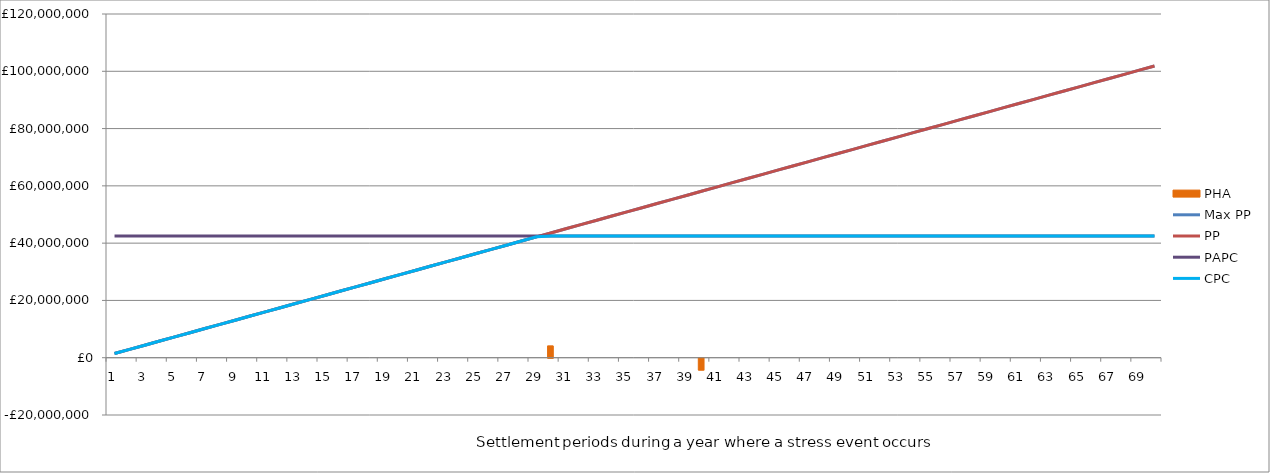
| Category | PHA |
|---|---|
| 0 | 0 |
| 1 | 0 |
| 2 | 0 |
| 3 | 0 |
| 4 | 0 |
| 5 | 0 |
| 6 | 0 |
| 7 | 0 |
| 8 | 0 |
| 9 | 0 |
| 10 | 0 |
| 11 | 0 |
| 12 | 0 |
| 13 | 0 |
| 14 | 0 |
| 15 | 0 |
| 16 | 0 |
| 17 | 0 |
| 18 | 0 |
| 19 | 0 |
| 20 | 0 |
| 21 | 0 |
| 22 | 0 |
| 23 | 0 |
| 24 | 0 |
| 25 | 0 |
| 26 | 0 |
| 27 | 0 |
| 28 | 0 |
| 29 | 4134000 |
| 30 | 0 |
| 31 | 0 |
| 32 | 0 |
| 33 | 0 |
| 34 | 0 |
| 35 | 0 |
| 36 | 0 |
| 37 | 0 |
| 38 | 0 |
| 39 | -4134000 |
| 40 | 0 |
| 41 | 0 |
| 42 | 0 |
| 43 | 0 |
| 44 | 0 |
| 45 | 0 |
| 46 | 0 |
| 47 | 0 |
| 48 | 0 |
| 49 | 0 |
| 50 | 0 |
| 51 | 0 |
| 52 | 0 |
| 53 | 0 |
| 54 | 0 |
| 55 | 0 |
| 56 | 0 |
| 57 | 0 |
| 58 | 0 |
| 59 | 0 |
| 60 | 0 |
| 61 | 0 |
| 62 | 0 |
| 63 | 0 |
| 64 | 0 |
| 65 | 0 |
| 66 | 0 |
| 67 | 0 |
| 68 | 0 |
| 69 | 0 |